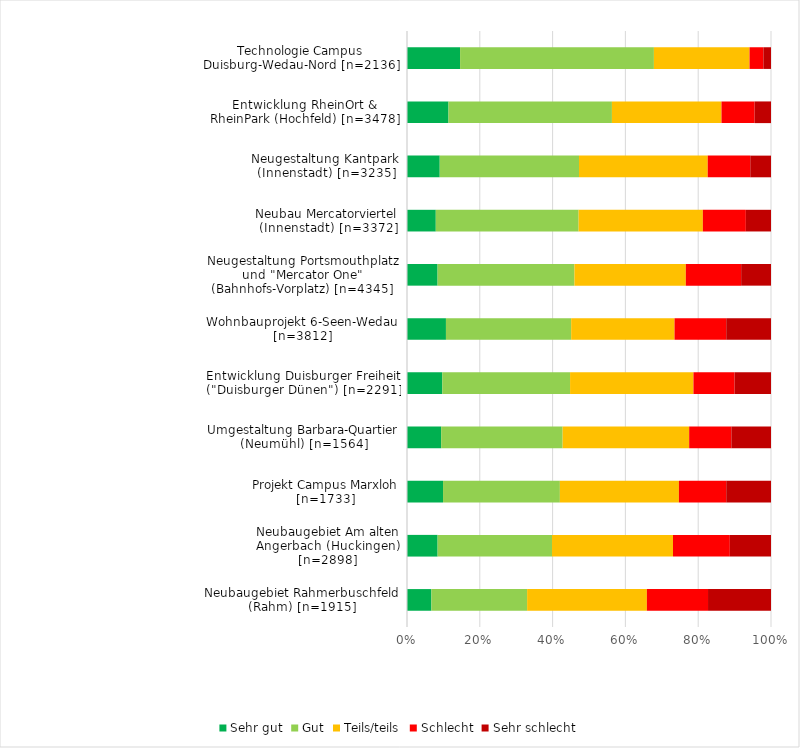
| Category | Sehr gut | Gut | Teils/teils | Schlecht | Sehr schlecht |
|---|---|---|---|---|---|
| Neubaugebiet Rahmerbuschfeld (Rahm) [n=1915] | 6.7 | 26.3 | 32.9 | 16.8 | 17.3 |
| Neubaugebiet Am alten Angerbach (Huckingen) [n=2898] | 8.4 | 31.4 | 33.2 | 15.6 | 11.3 |
| Projekt Campus Marxloh [n=1733] | 9.9 | 32.1 | 32.7 | 13 | 12.3 |
| Umgestaltung Barbara-Quartier (Neumühl) [n=1564] | 9.4 | 33.4 | 34.8 | 11.6 | 10.9 |
| Entwicklung Duisburger Freiheit ("Duisburger Dünen") [n=2291] | 9.7 | 35.1 | 33.9 | 11.3 | 10 |
| Wohnbauprojekt 6-Seen-Wedau [n=3812] | 10.7 | 34.4 | 28.4 | 14.2 | 12.3 |
| Neugestaltung Portsmouthplatz und "Mercator One" (Bahnhofs-Vorplatz) [n=4345] | 8.4 | 37.6 | 30.6 | 15.2 | 8.2 |
| Neubau Mercatorviertel (Innenstadt) [n=3372] | 7.9 | 39.2 | 34.1 | 11.8 | 6.9 |
| Neugestaltung Kantpark (Innenstadt) [n=3235] | 9 | 38.3 | 35.4 | 11.7 | 5.7 |
| Entwicklung RheinOrt & RheinPark (Hochfeld) [n=3478] | 11.4 | 44.9 | 30.1 | 9.1 | 4.5 |
| Technologie Campus Duisburg-Wedau-Nord [n=2136] | 14.6 | 53.3 | 26.3 | 3.8 | 2.1 |